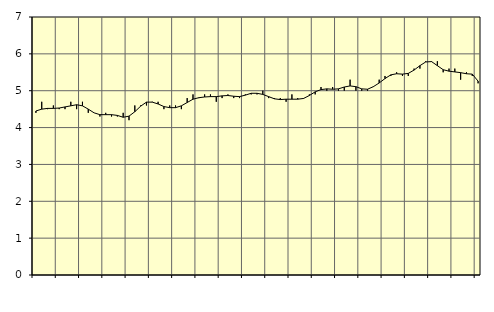
| Category | Piggar | Personliga och kulturella tjänster, SNI 90-98 |
|---|---|---|
| nan | 4.4 | 4.45 |
| 1.0 | 4.7 | 4.5 |
| 1.0 | 4.5 | 4.52 |
| 1.0 | 4.6 | 4.52 |
| nan | 4.5 | 4.53 |
| 2.0 | 4.5 | 4.56 |
| 2.0 | 4.7 | 4.59 |
| 2.0 | 4.5 | 4.62 |
| nan | 4.7 | 4.59 |
| 3.0 | 4.4 | 4.5 |
| 3.0 | 4.4 | 4.4 |
| 3.0 | 4.3 | 4.35 |
| nan | 4.4 | 4.35 |
| 4.0 | 4.3 | 4.35 |
| 4.0 | 4.3 | 4.33 |
| 4.0 | 4.4 | 4.28 |
| nan | 4.2 | 4.31 |
| 5.0 | 4.6 | 4.43 |
| 5.0 | 4.6 | 4.58 |
| 5.0 | 4.6 | 4.69 |
| nan | 4.7 | 4.69 |
| 6.0 | 4.7 | 4.64 |
| 6.0 | 4.5 | 4.57 |
| 6.0 | 4.6 | 4.54 |
| nan | 4.6 | 4.54 |
| 7.0 | 4.5 | 4.59 |
| 7.0 | 4.8 | 4.68 |
| 7.0 | 4.9 | 4.77 |
| nan | 4.8 | 4.81 |
| 8.0 | 4.9 | 4.83 |
| 8.0 | 4.9 | 4.84 |
| 8.0 | 4.7 | 4.84 |
| nan | 4.8 | 4.86 |
| 9.0 | 4.9 | 4.87 |
| 9.0 | 4.8 | 4.85 |
| 9.0 | 4.8 | 4.84 |
| nan | 4.9 | 4.88 |
| 10.0 | 4.9 | 4.93 |
| 10.0 | 4.9 | 4.93 |
| 10.0 | 5 | 4.9 |
| nan | 4.8 | 4.84 |
| 11.0 | 4.8 | 4.78 |
| 11.0 | 4.8 | 4.76 |
| 11.0 | 4.7 | 4.77 |
| nan | 4.9 | 4.77 |
| 12.0 | 4.8 | 4.77 |
| 12.0 | 4.8 | 4.79 |
| 12.0 | 4.9 | 4.87 |
| nan | 4.9 | 4.97 |
| 13.0 | 5.1 | 5.03 |
| 13.0 | 5 | 5.05 |
| 13.0 | 5.1 | 5.04 |
| nan | 5 | 5.05 |
| 14.0 | 5 | 5.1 |
| 14.0 | 5.3 | 5.13 |
| 14.0 | 5 | 5.11 |
| nan | 5 | 5.05 |
| 15.0 | 5 | 5.04 |
| 15.0 | 5.1 | 5.11 |
| 15.0 | 5.3 | 5.21 |
| nan | 5.4 | 5.33 |
| 16.0 | 5.4 | 5.43 |
| 16.0 | 5.5 | 5.46 |
| 16.0 | 5.4 | 5.45 |
| nan | 5.4 | 5.47 |
| 17.0 | 5.6 | 5.56 |
| 17.0 | 5.6 | 5.68 |
| 17.0 | 5.8 | 5.78 |
| nan | 5.8 | 5.79 |
| 18.0 | 5.8 | 5.68 |
| 18.0 | 5.5 | 5.57 |
| 18.0 | 5.6 | 5.53 |
| nan | 5.6 | 5.51 |
| 19.0 | 5.3 | 5.49 |
| 19.0 | 5.5 | 5.46 |
| 19.0 | 5.4 | 5.45 |
| nan | 5.2 | 5.26 |